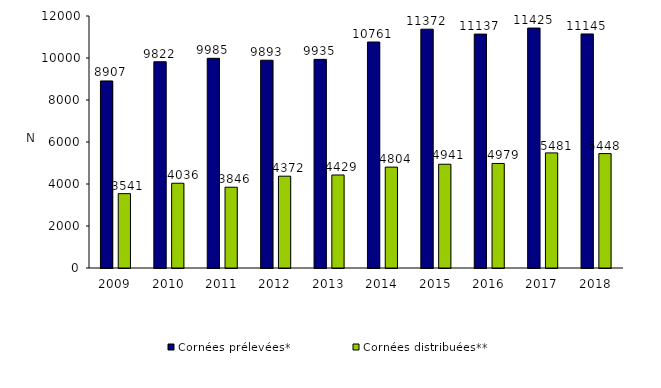
| Category | Cornées prélevées* | Cornées distribuées** |
|---|---|---|
| 2009.0 | 8907 | 3541 |
| 2010.0 | 9822 | 4036 |
| 2011.0 | 9985 | 3846 |
| 2012.0 | 9893 | 4372 |
| 2013.0 | 9935 | 4429 |
| 2014.0 | 10761 | 4804 |
| 2015.0 | 11372 | 4941 |
| 2016.0 | 11137 | 4979 |
| 2017.0 | 11425 | 5481 |
| 2018.0 | 11145 | 5448 |